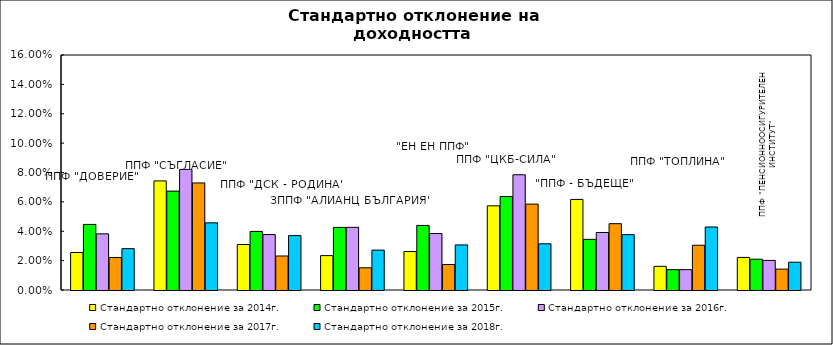
| Category | Стандартно отклонение за 2014г. | Стандартно отклонение за 2015г. | Стандартно отклонение за 2016г. | Стандартно отклонение за 2017г. | Стандартно отклонение за 2018г. |
|---|---|---|---|---|---|
| ППФ "ДОВЕРИЕ"  | 0.026 | 0.045 | 0.038 | 0.022 | 0.028 |
| ППФ "СЪГЛАСИЕ"  | 0.074 | 0.067 | 0.082 | 0.073 | 0.046 |
| ППФ "ДСК - РОДИНА" | 0.031 | 0.04 | 0.038 | 0.023 | 0.037 |
| ЗППФ "АЛИАНЦ БЪЛГАРИЯ" | 0.023 | 0.043 | 0.043 | 0.015 | 0.027 |
| "ЕН ЕН ППФ" | 0.026 | 0.044 | 0.038 | 0.017 | 0.031 |
| ППФ "ЦКБ-СИЛА" | 0.057 | 0.064 | 0.078 | 0.058 | 0.031 |
| "ППФ - БЪДЕЩЕ" | 0.062 | 0.034 | 0.039 | 0.045 | 0.038 |
| ППФ "ТОПЛИНА" | 0.016 | 0.014 | 0.014 | 0.03 | 0.043 |
| ППФ "ПЕНСИОННООСИГУРИТЕЛЕН ИНСТИТУТ" | 0.022 | 0.021 | 0.02 | 0.014 | 0.019 |